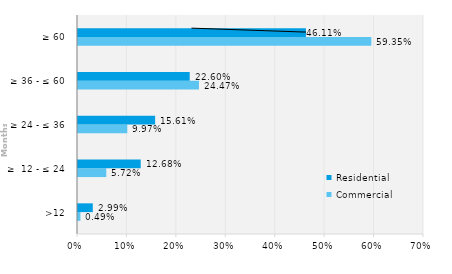
| Category | Commercial | Residential |
|---|---|---|
| >12 | 0.005 | 0.03 |
| ≥  12 - ≤ 24 | 0.057 | 0.127 |
| ≥ 24 - ≤ 36 | 0.1 | 0.156 |
| ≥ 36 - ≤ 60 | 0.245 | 0.226 |
| ≥ 60 | 0.593 | 0.461 |